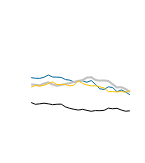
| Category | East | North | South | West |
|---|---|---|---|---|
| 0 | 5396 | 4776 | 4527 | 3134 |
| 1 | 5336 | 4745 | 4689 | 2969 |
| 2 | 5329 | 4695 | 4622 | 3018 |
| 3 | 5431 | 4857 | 4707 | 3070 |
| 4 | 5639 | 4967 | 4844 | 3016 |
| 5 | 5451 | 4771 | 5014 | 2938 |
| 6 | 5443 | 4658 | 4767 | 2976 |
| 7 | 5415 | 4725 | 4785 | 2987 |
| 8 | 5222 | 4821 | 4766 | 2738 |
| 9 | 5169 | 4897 | 4646 | 2607 |
| 10 | 4998 | 5013 | 4720 | 2517 |
| 11 | 5074 | 5100 | 5103 | 2451 |
| 12 | 5112 | 5176 | 4866 | 2514 |
| 13 | 4977 | 5398 | 4733 | 2420 |
| 14 | 5137 | 5433 | 4643 | 2337 |
| 15 | 4784 | 5184 | 4660 | 2404 |
| 16 | 4378 | 5121 | 4556 | 2393 |
| 17 | 4326 | 5142 | 4470 | 2421 |
| 18 | 4563 | 5087 | 4125 | 2622 |
| 19 | 4494 | 4796 | 4131 | 2567 |
| 20 | 4121 | 4502 | 4100 | 2609 |
| 21 | 4276 | 4530 | 4130 | 2452 |
| 22 | 4089 | 4369 | 4070 | 2343 |
| 23 | 3847 | 4082 | 4197 | 2381 |